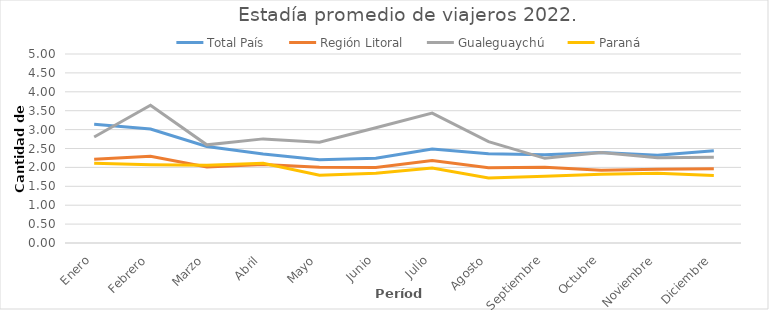
| Category | Total País | Región Litoral | Gualeguaychú | Paraná |
|---|---|---|---|---|
| Enero | 3.144 | 2.214 | 2.804 | 2.108 |
| Febrero | 3.016 | 2.293 | 3.643 | 2.073 |
| Marzo | 2.555 | 2.013 | 2.597 | 2.056 |
| Abril | 2.353 | 2.078 | 2.754 | 2.108 |
| Mayo | 2.201 | 2.001 | 2.664 | 1.79 |
| Junio | 2.243 | 1.999 | 3.05 | 1.847 |
| Julio | 2.487 | 2.181 | 3.435 | 1.983 |
| Agosto | 2.363 | 1.993 | 2.68 | 1.721 |
| Septiembre | 2.338 | 2.006 | 2.24 | 1.764 |
| Octubre | 2.392 | 1.928 | 2.395 | 1.816 |
| Noviembre | 2.324 | 1.953 | 2.258 | 1.846 |
| Diciembre | 2.438 | 1.963 | 2.27 | 1.785 |